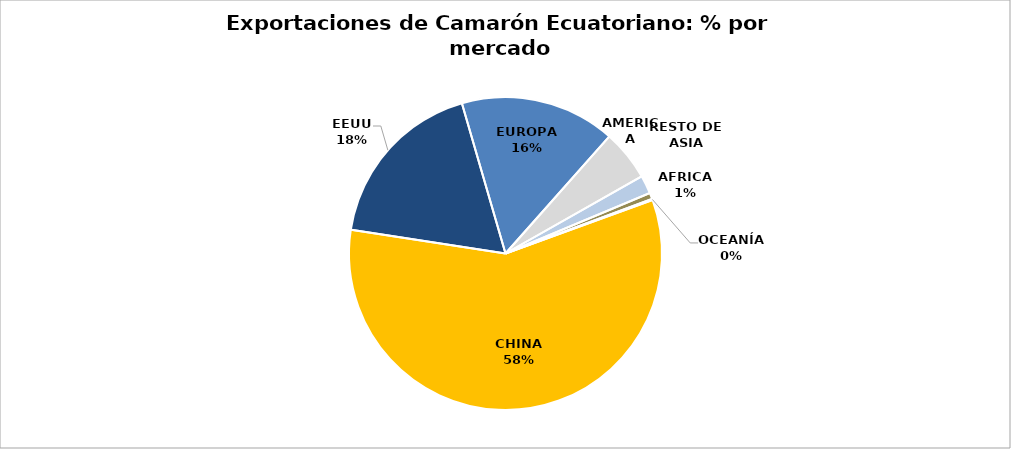
| Category | Series 0 |
|---|---|
| CHINA | 0.58 |
| EEUU | 0.181 |
| EUROPA | 0.16 |
| RESTO DE ASIA | 0.052 |
| AMERICA | 0.019 |
| AFRICA  | 0.006 |
| OCEANÍA | 0.001 |